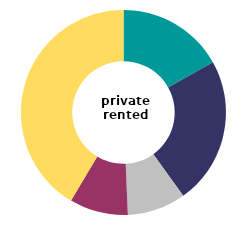
| Category | private
 rented |
|---|---|
| garage or car port - on plot | 16.85 |
| designated parking space - on plot | 23.253 |
| off plot designated parking | 9.219 |
| communal parking  | 9.231 |
| no designated parking provision | 41.448 |